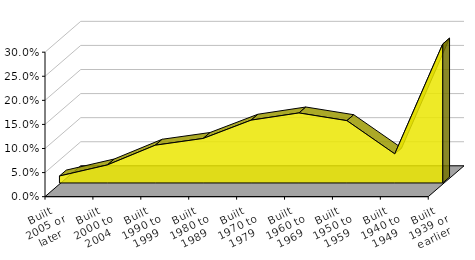
| Category | Monroe |
|---|---|
| Built 2005 or later | 0.017 |
| Built 2000 to 2004 | 0.04 |
| Built 1990 to 1999 | 0.081 |
| Built 1980 to 1989 | 0.095 |
| Built 1970 to 1979 | 0.133 |
| Built 1960 to 1969 | 0.148 |
| Built 1950 to 1959 | 0.132 |
| Built 1940 to 1949 | 0.063 |
| Built 1939 or earlier | 0.291 |